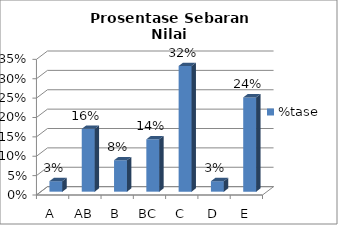
| Category | %tase |
|---|---|
| A | 0.027 |
| AB | 0.162 |
| B | 0.081 |
| BC | 0.135 |
| C | 0.324 |
| D | 0.027 |
| E | 0.243 |